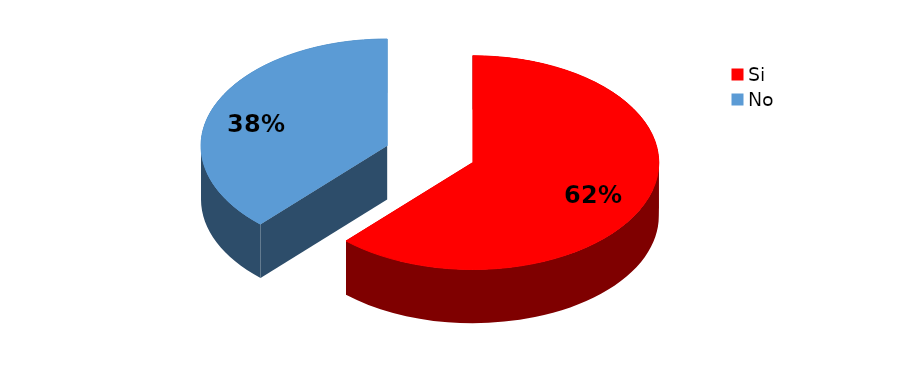
| Category | Series 0 |
|---|---|
| Si | 13 |
| No | 8 |